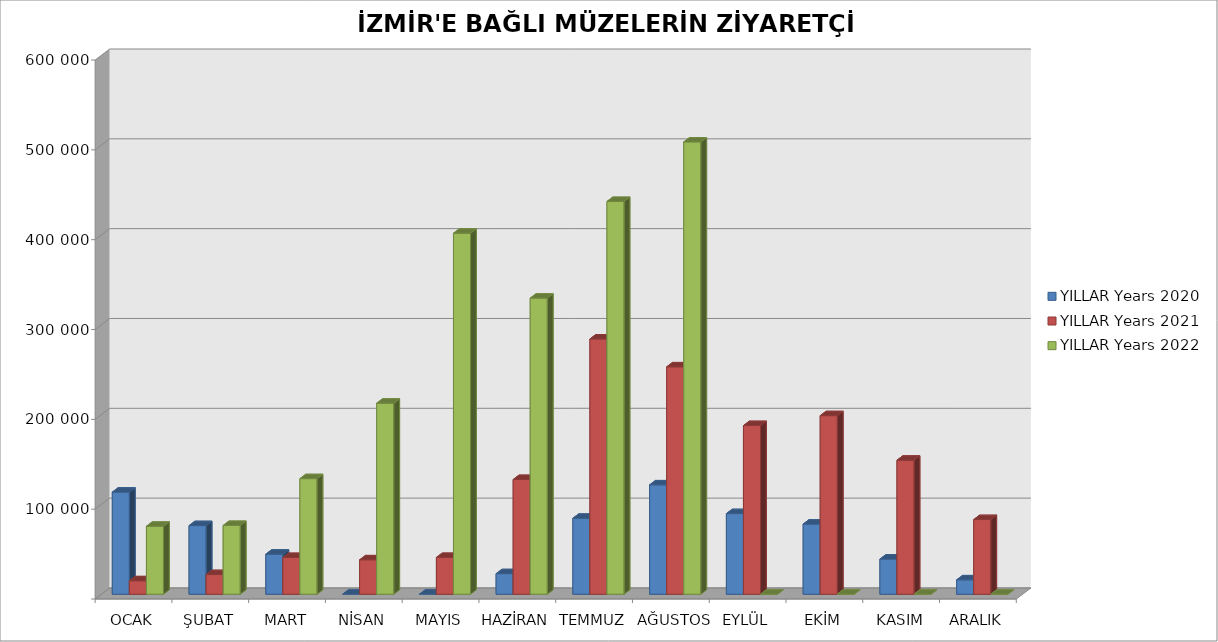
| Category | YILLAR Years 2020 | YILLAR Years 2021 | YILLAR Years 2022 |
|---|---|---|---|
| OCAK | 113675 | 14992 | 75648 |
| ŞUBAT | 76403 | 21877 | 76569 |
| MART | 44613 | 40903 | 128664 |
| NİSAN | 0 | 38306 | 212657 |
| MAYIS | 0 | 40946 | 401887 |
| HAZİRAN | 22885 | 127729 | 329617 |
| TEMMUZ | 84548 | 284174 | 437234 |
| AĞUSTOS | 121753 | 253129 | 503510 |
| EYLÜL | 89757 | 187775 | 0 |
| EKİM | 78061 | 198786 | 0 |
| KASIM | 39134 | 149190 | 0 |
| ARALIK | 16010 | 83118 | 0 |